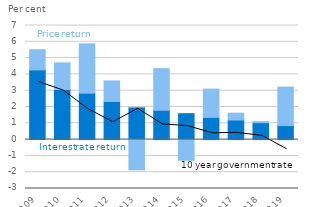
| Category | Interest rate return | Price return |
|---|---|---|
| 2009.0 | 4.275 | 1.238 |
| 2010.0 | 3.073 | 1.636 |
| 2011.0 | 2.85 | 3.027 |
| 2012.0 | 2.336 | 1.263 |
| 2013.0 | 1.948 | -1.855 |
| 2014.0 | 1.803 | 2.549 |
| 2015.0 | 1.59 | -1.267 |
| 2016.0 | 1.362 | 1.735 |
| 2017.0 | 1.201 | 0.42 |
| 2018.0 | 1.04 | 0.061 |
| 2019.0 | 0.86 | 2.361 |